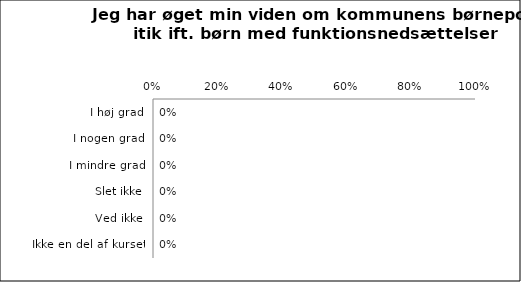
| Category | Øget viden om kommunens børnepolitik ift. Børn med funktionsnedsættelse |
|---|---|
| I høj grad | 0 |
| I nogen grad | 0 |
| I mindre grad | 0 |
| Slet ikke | 0 |
| Ved ikke | 0 |
| Ikke en del af kurset | 0 |